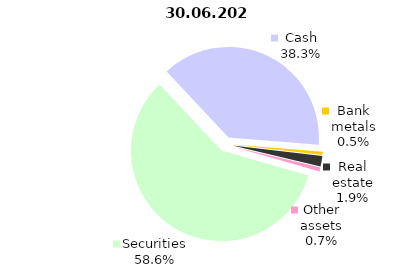
| Category | Total |
|---|---|
| Securities | 1058.161 |
| Cash | 691.315 |
| Bank metals | 9.733 |
| Real estate | 34.26 |
| Other assets | 12.848 |